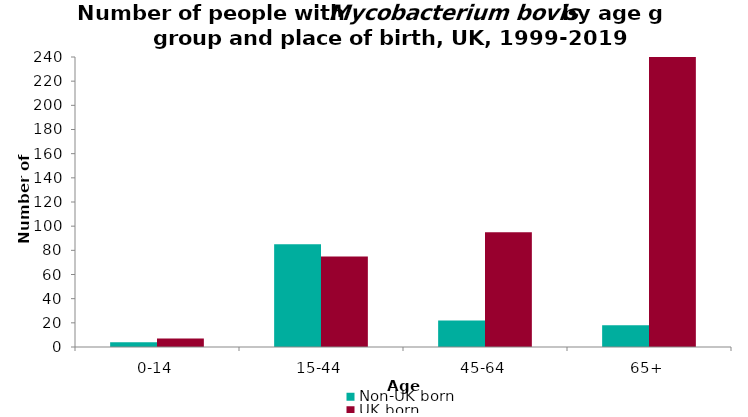
| Category | Non-UK born | UK born |
|---|---|---|
| 0-14 | 4 | 7 |
| 15-44 | 85 | 75 |
| 45-64 | 22 | 95 |
| 65+ | 18 | 240 |